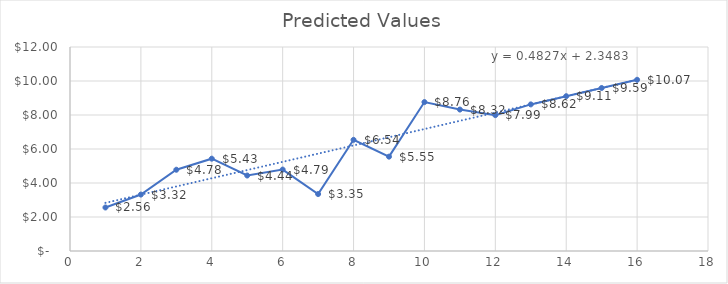
| Category | Series 0 |
|---|---|
| 1.0 | 2.56 |
| 2.0 | 3.32 |
| 3.0 | 4.78 |
| 4.0 | 5.43 |
| 5.0 | 4.44 |
| 6.0 | 4.79 |
| 7.0 | 3.35 |
| 8.0 | 6.54 |
| 9.0 | 5.55 |
| 10.0 | 8.76 |
| 11.0 | 8.32 |
| 12.0 | 7.99 |
| 13.0 | 8.623 |
| 14.0 | 9.106 |
| 15.0 | 9.589 |
| 16.0 | 10.071 |